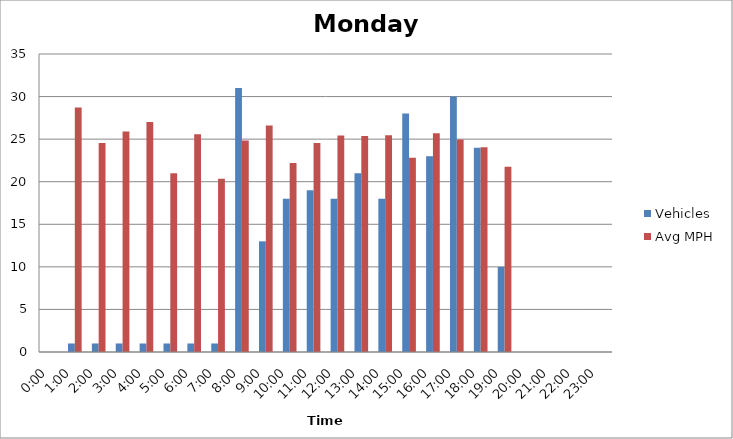
| Category | Vehicles | Avg MPH |
|---|---|---|
| 0:00 | 0 | 0 |
| 1:00 | 1 | 28.72 |
| 2:00 | 1 | 24.56 |
| 3:00 | 1 | 25.89 |
| 4:00 | 1 | 27.01 |
| 5:00 | 1 | 21 |
| 6:00 | 1 | 25.56 |
| 7:00 | 1 | 20.34 |
| 8:00 | 31 | 24.83 |
| 9:00 | 13 | 26.6 |
| 10:00 | 18 | 22.19 |
| 11:00 | 19 | 24.54 |
| 12:00 | 18 | 25.43 |
| 13:00 | 21 | 25.37 |
| 14:00 | 18 | 25.45 |
| 15:00 | 28 | 22.82 |
| 16:00 | 23 | 25.69 |
| 17:00 | 30 | 24.96 |
| 18:00 | 24 | 24.04 |
| 19:00 | 10 | 21.76 |
| 20:00 | 0 | 0 |
| 21:00 | 0 | 0 |
| 22:00 | 0 | 0 |
| 23:00 | 0 | 0 |